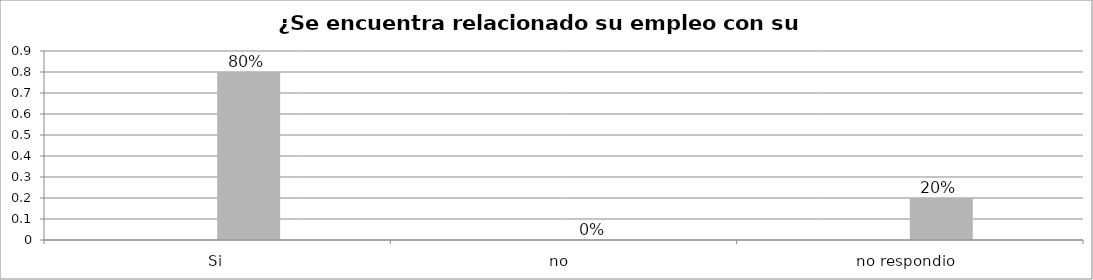
| Category | Series 0 | Series 1 | Series 2 | Series 3 |
|---|---|---|---|---|
| Si |  |  | 0.8 |  |
| no  |  |  | 0 |  |
| no respondio  |  |  | 0.2 |  |